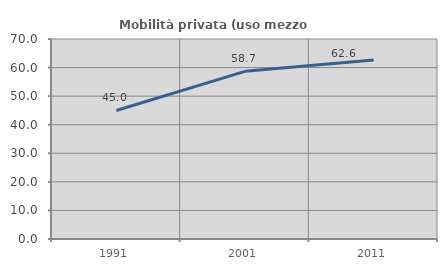
| Category | Mobilità privata (uso mezzo privato) |
|---|---|
| 1991.0 | 44.976 |
| 2001.0 | 58.672 |
| 2011.0 | 62.649 |